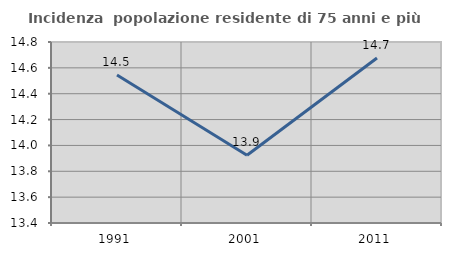
| Category | Incidenza  popolazione residente di 75 anni e più |
|---|---|
| 1991.0 | 14.545 |
| 2001.0 | 13.924 |
| 2011.0 | 14.677 |